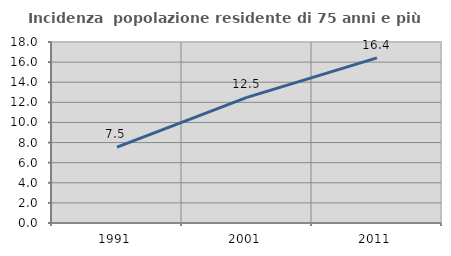
| Category | Incidenza  popolazione residente di 75 anni e più |
|---|---|
| 1991.0 | 7.549 |
| 2001.0 | 12.49 |
| 2011.0 | 16.421 |